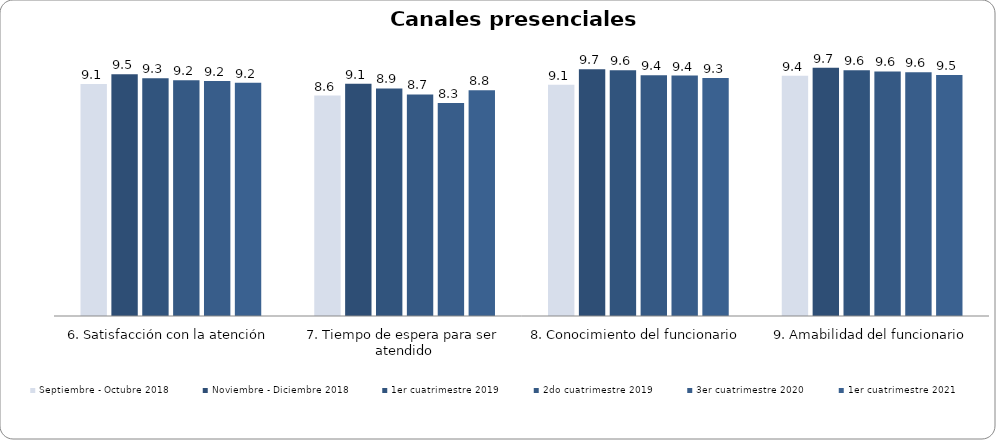
| Category | Septiembre - Octubre 2018 | Noviembre - Diciembre 2018 | 1er cuatrimestre 2019 | 2do cuatrimestre 2019 | 3er cuatrimestre 2020 | 1er cuatrimestre 2021 |
|---|---|---|---|---|---|---|
| 6. Satisfacción con la atención | 9.097 | 9.48 | 9.321 | 9.246 | 9.215 | 9.152 |
| 7. Tiempo de espera para ser atendido | 8.645 | 9.107 | 8.925 | 8.689 | 8.348 | 8.848 |
| 8. Conocimiento del funcionario | 9.065 | 9.68 | 9.642 | 9.443 | 9.43 | 9.333 |
| 9. Amabilidad del funcionario | 9.419 | 9.733 | 9.642 | 9.59 | 9.556 | 9.455 |